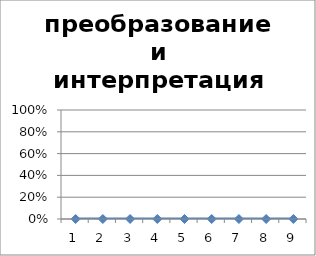
| Category | преобразование и интерпретация информации |
|---|---|
| 1.0 | 0 |
| 2.0 | 0 |
| 3.0 | 0 |
| 4.0 | 0 |
| 5.0 | 0 |
| 6.0 | 0 |
| 7.0 | 0 |
| 8.0 | 0 |
| 9.0 | 0 |